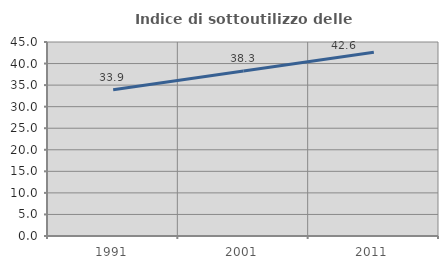
| Category | Indice di sottoutilizzo delle abitazioni  |
|---|---|
| 1991.0 | 33.912 |
| 2001.0 | 38.253 |
| 2011.0 | 42.639 |